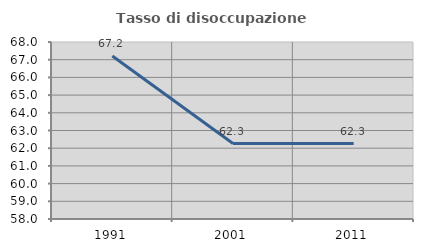
| Category | Tasso di disoccupazione giovanile  |
|---|---|
| 1991.0 | 67.213 |
| 2001.0 | 62.264 |
| 2011.0 | 62.264 |